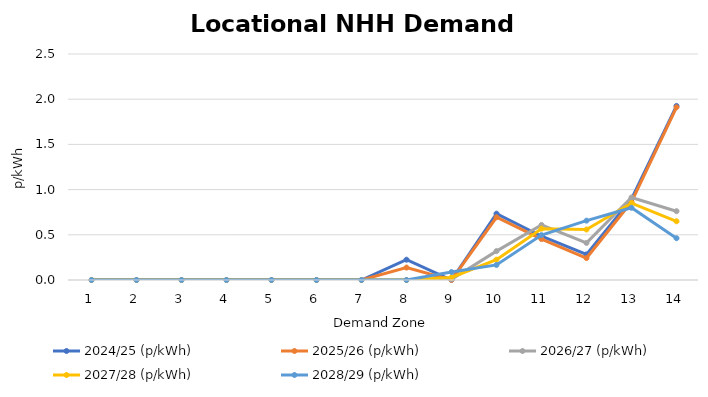
| Category | 2024/25 (p/kWh) | 2025/26 (p/kWh) | 2026/27 (p/kWh) | 2027/28 (p/kWh) | 2028/29 (p/kWh) |
|---|---|---|---|---|---|
| 1.0 | 0 | 0 | 0 | 0 | 0 |
| 2.0 | 0 | 0 | 0 | 0 | 0 |
| 3.0 | 0 | 0 | 0 | 0 | 0 |
| 4.0 | 0 | 0 | 0 | 0 | 0 |
| 5.0 | 0 | 0 | 0 | 0 | 0 |
| 6.0 | 0 | 0 | 0 | 0 | 0 |
| 7.0 | 0 | 0 | 0 | 0 | 0 |
| 8.0 | 0.224 | 0.138 | 0 | 0 | 0 |
| 9.0 | 0 | 0 | 0.007 | 0.029 | 0.088 |
| 10.0 | 0.734 | 0.694 | 0.319 | 0.225 | 0.167 |
| 11.0 | 0.484 | 0.453 | 0.609 | 0.568 | 0.497 |
| 12.0 | 0.283 | 0.243 | 0.41 | 0.558 | 0.657 |
| 13.0 | 0.896 | 0.863 | 0.913 | 0.851 | 0.799 |
| 14.0 | 1.926 | 1.911 | 0.761 | 0.65 | 0.462 |